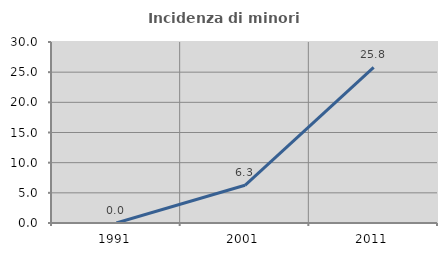
| Category | Incidenza di minori stranieri |
|---|---|
| 1991.0 | 0 |
| 2001.0 | 6.25 |
| 2011.0 | 25.806 |